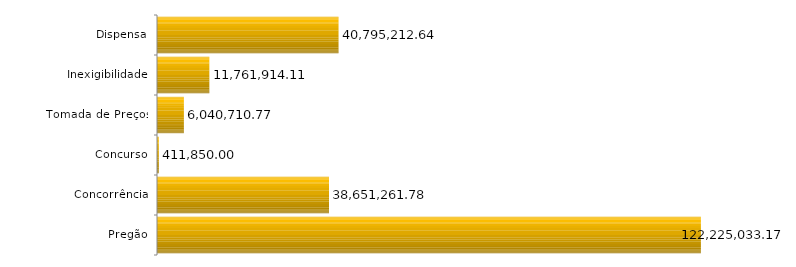
| Category | Series 0 |
|---|---|
| Pregão | 122225033.17 |
| Concorrência | 38651261.78 |
| Concurso | 411850 |
| Tomada de Preços | 6040710.77 |
| Inexigibilidade | 11761914.11 |
| Dispensa | 40795212.64 |